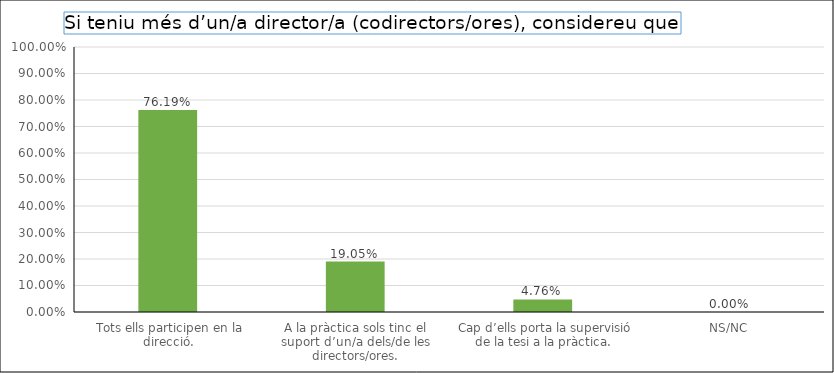
| Category | Series 0 |
|---|---|
|  Tots ells participen en la direcció. | 0.762 |
| A la pràctica sols tinc el suport d’un/a dels/de les directors/ores. | 0.19 |
|  Cap d’ells porta la supervisió de la tesi a la pràctica. | 0.048 |
| NS/NC | 0 |